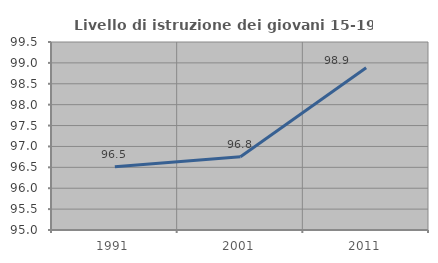
| Category | Livello di istruzione dei giovani 15-19 anni |
|---|---|
| 1991.0 | 96.513 |
| 2001.0 | 96.755 |
| 2011.0 | 98.883 |